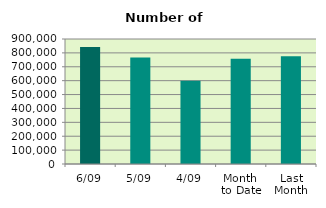
| Category | Series 0 |
|---|---|
| 6/09 | 843188 |
| 5/09 | 766914 |
| 4/09 | 599344 |
| Month 
to Date | 758320 |
| Last
Month | 775779.217 |